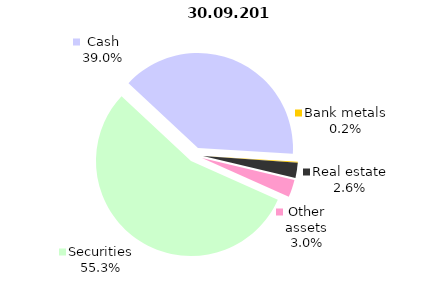
| Category | 30.09.2019 |
|---|---|
| Securities | 1643.3 |
| Cash | 1160.3 |
| Bank metals | 5 |
| Real estate | 76 |
| Other assets | 88.1 |